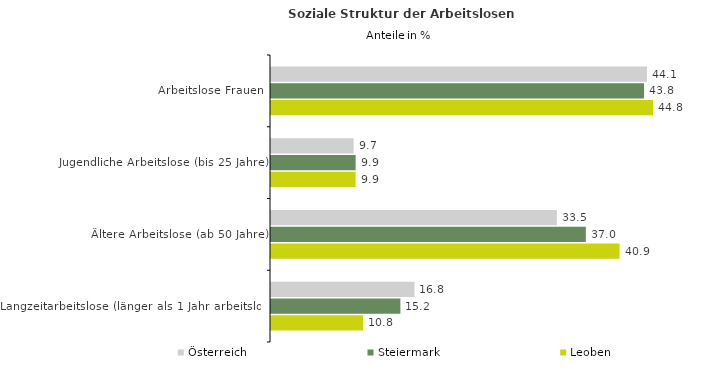
| Category | Österreich | Steiermark | Leoben |
|---|---|---|---|
| Arbeitslose Frauen | 44.136 | 43.785 | 44.836 |
| Jugendliche Arbeitslose (bis 25 Jahre) | 9.698 | 9.935 | 9.928 |
| Ältere Arbeitslose (ab 50 Jahre) | 33.548 | 36.954 | 40.913 |
| Langzeitarbeitslose (länger als 1 Jahr arbeitslos) | 16.836 | 15.186 | 10.809 |